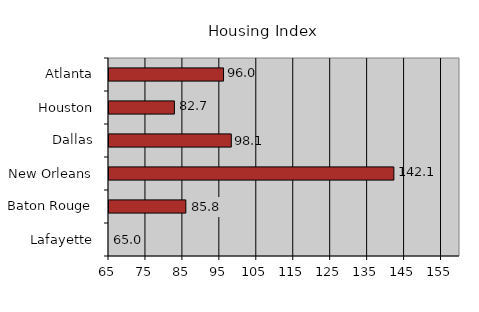
| Category | 65.0 |
|---|---|
| Lafayette | 65 |
| Baton Rouge | 85.8 |
| New Orleans | 142.1 |
| Dallas | 98.1 |
| Houston | 82.7 |
| Atlanta | 96 |